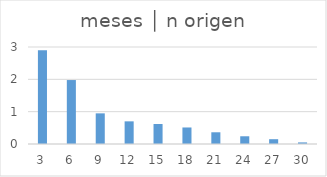
| Category | meses │ n origen |
|---|---|
| 3.0 | 2.901 |
| 6.0 | 1.978 |
| 9.0 | 0.948 |
| 12.0 | 0.701 |
| 15.0 | 0.618 |
| 18.0 | 0.511 |
| 21.0 | 0.363 |
| 24.0 | 0.239 |
| 27.0 | 0.148 |
| 30.0 | 0.049 |